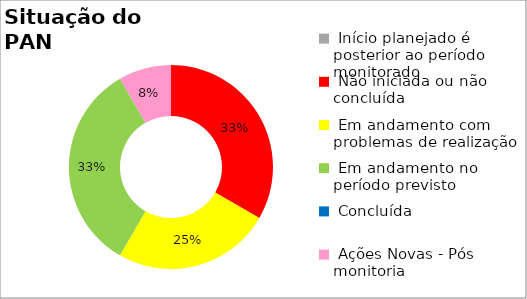
| Category | Series 0 |
|---|---|
|  Início planejado é posterior ao período monitorado | 0 |
|  Não iniciada ou não concluída | 0.333 |
|  Em andamento com problemas de realização | 0.25 |
|  Em andamento no período previsto  | 0.333 |
|  Concluída | 0 |
|  Ações Novas - Pós monitoria | 0.083 |